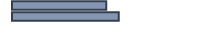
| Category | 46,9 |
|---|---|
| 0 | 46.894 |
| 1 | 53.106 |